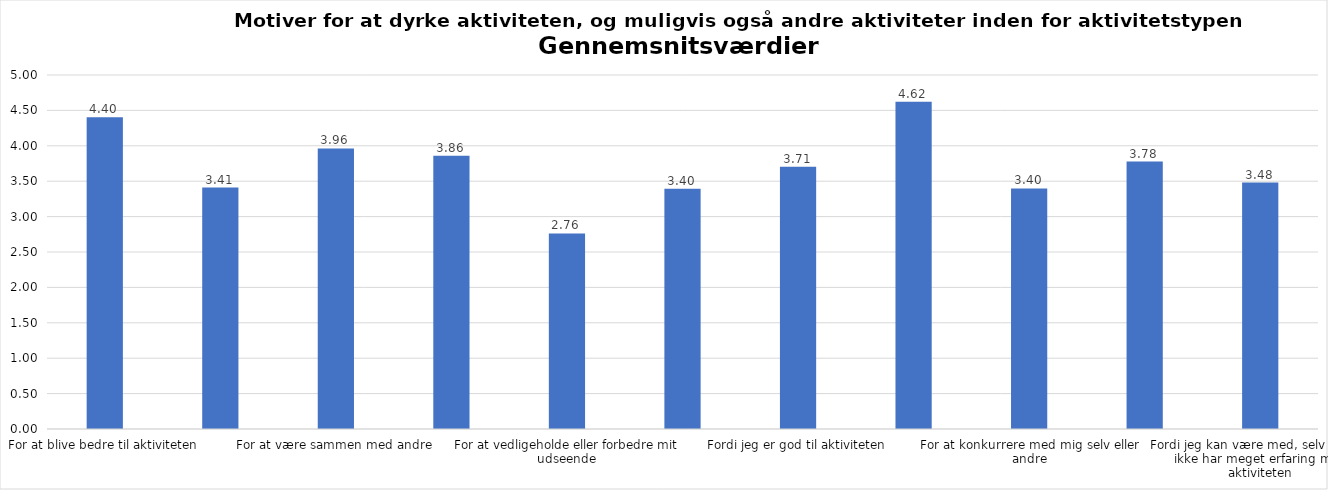
| Category | Gennemsnit |
|---|---|
| For at blive bedre til aktiviteten | 4.403 |
| For at vedligeholde eller forbedre min sundhed (fx helbred, fysisk form) | 3.409 |
| For at være sammen med andre | 3.963 |
| For at gøre noget godt for mig selv | 3.86 |
| For at vedligeholde eller forbedre mit udseende | 2.761 |
| Fordi andre i min omgangskreds opmuntrer mig til det | 3.395 |
| Fordi jeg er god til aktiviteten | 3.706 |
| Fordi jeg godt kan lide aktiviteten | 4.623 |
| For at konkurrere med mig selv eller andre | 3.397 |
| Fordi aktiviteten passer godt ind i min hverdag | 3.778 |
| Fordi jeg kan være med, selv om jeg ikke har meget erfaring med aktiviteten | 3.481 |